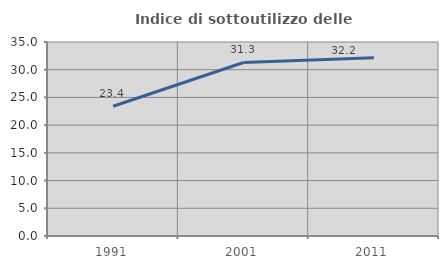
| Category | Indice di sottoutilizzo delle abitazioni  |
|---|---|
| 1991.0 | 23.409 |
| 2001.0 | 31.308 |
| 2011.0 | 32.172 |